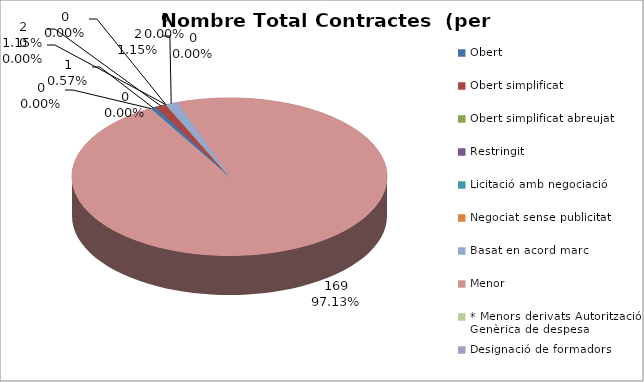
| Category | Nombre Total Contractes |
|---|---|
| Obert | 1 |
| Obert simplificat | 2 |
| Obert simplificat abreujat | 0 |
| Restringit | 0 |
| Licitació amb negociació | 0 |
| Negociat sense publicitat | 0 |
| Basat en acord marc | 2 |
| Menor | 169 |
| * Menors derivats Autorització Genèrica de despesa | 0 |
| Designació de formadors | 0 |